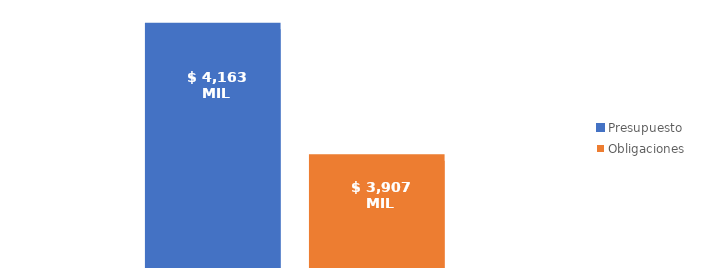
| Category | Presupuesto | Obligaciones |
|---|---|---|
| Total | 4162544579415.142 | 3906505830065.99 |